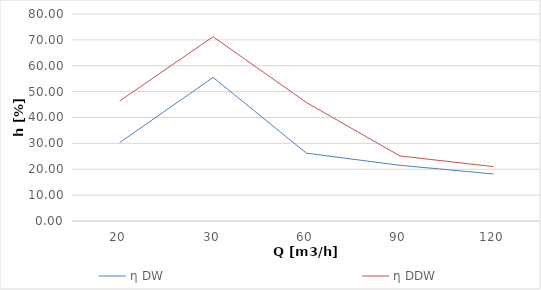
| Category | η DW | η DDW |
|---|---|---|
| 20.0 | 30.298 | 46.38 |
| 30.0 | 55.486 | 71.218 |
| 60.0 | 26.203 | 45.778 |
| 90.0 | 21.533 | 25.143 |
| 120.0 | 18.174 | 21.016 |